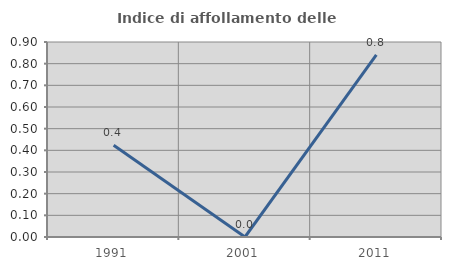
| Category | Indice di affollamento delle abitazioni  |
|---|---|
| 1991.0 | 0.424 |
| 2001.0 | 0 |
| 2011.0 | 0.84 |